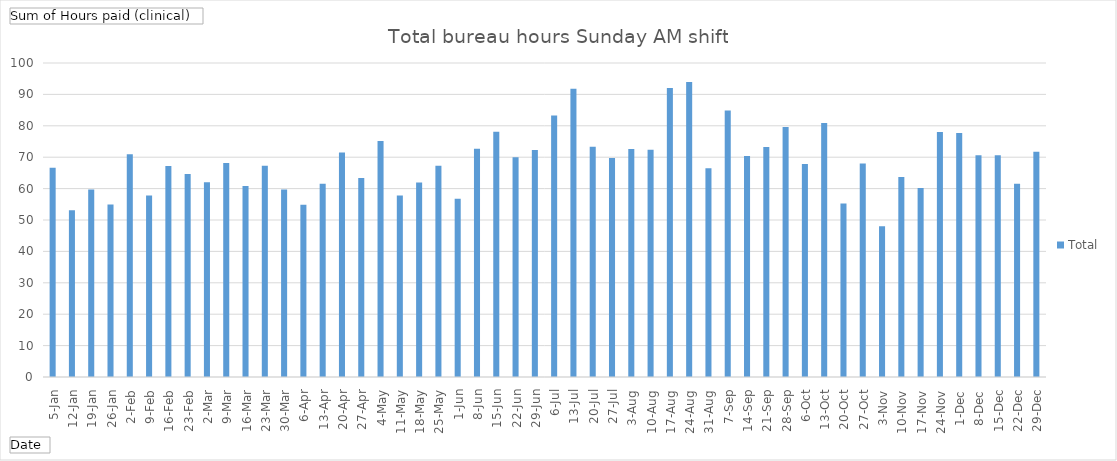
| Category | Total |
|---|---|
| 5-Jan | 66.669 |
| 12-Jan | 53.137 |
| 19-Jan | 59.71 |
| 26-Jan | 54.97 |
| 2-Feb | 70.941 |
| 9-Feb | 57.784 |
| 16-Feb | 67.19 |
| 23-Feb | 64.681 |
| 2-Mar | 62.044 |
| 9-Mar | 68.117 |
| 16-Mar | 60.825 |
| 23-Mar | 67.305 |
| 30-Mar | 59.71 |
| 6-Apr | 54.877 |
| 13-Apr | 61.576 |
| 20-Apr | 71.534 |
| 27-Apr | 63.367 |
| 4-May | 75.152 |
| 11-May | 57.784 |
| 18-May | 61.941 |
| 25-May | 67.245 |
| 1-Jun | 56.772 |
| 8-Jun | 72.7 |
| 15-Jun | 78.12 |
| 22-Jun | 70.014 |
| 29-Jun | 72.255 |
| 6-Jul | 83.288 |
| 13-Jul | 91.766 |
| 20-Jul | 73.36 |
| 27-Jul | 69.734 |
| 3-Aug | 72.578 |
| 10-Aug | 72.391 |
| 17-Aug | 92.016 |
| 24-Aug | 93.911 |
| 31-Aug | 66.46 |
| 7-Sep | 84.902 |
| 14-Sep | 70.422 |
| 21-Sep | 73.285 |
| 28-Sep | 79.588 |
| 6-Oct | 67.847 |
| 13-Oct | 80.902 |
| 20-Oct | 55.294 |
| 27-Oct | 68 |
| 3-Nov | 48 |
| 10-Nov | 63.712 |
| 17-Nov | 60.191 |
| 24-Nov | 77.992 |
| 1-Dec | 77.712 |
| 8-Dec | 70.597 |
| 15-Dec | 70.617 |
| 22-Dec | 61.554 |
| 29-Dec | 71.722 |